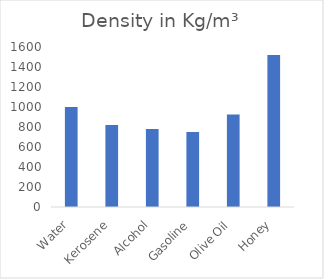
| Category | Density in Kg/m³ |
|---|---|
| Water | 1000 |
| Kerosene | 820 |
| Alcohol | 780 |
| Gasoline | 750 |
| Olive Oil | 925 |
| Honey | 1520 |